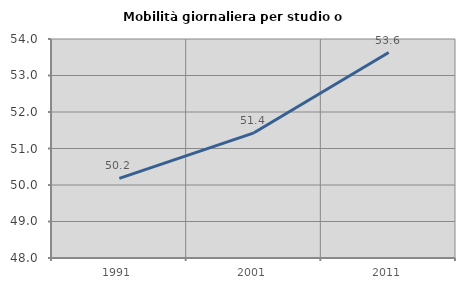
| Category | Mobilità giornaliera per studio o lavoro |
|---|---|
| 1991.0 | 50.181 |
| 2001.0 | 51.429 |
| 2011.0 | 53.628 |